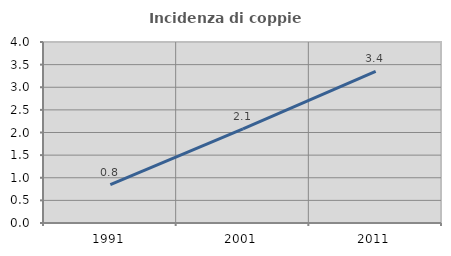
| Category | Incidenza di coppie miste |
|---|---|
| 1991.0 | 0.85 |
| 2001.0 | 2.078 |
| 2011.0 | 3.352 |